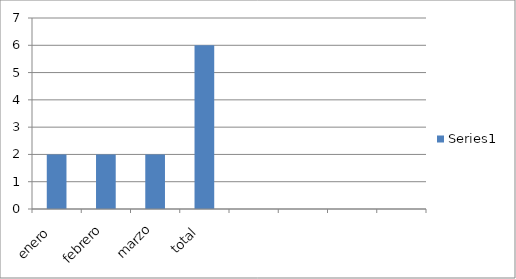
| Category | Series 0 |
|---|---|
| enero  | 2 |
| febrero | 2 |
| marzo | 2 |
| total  | 6 |